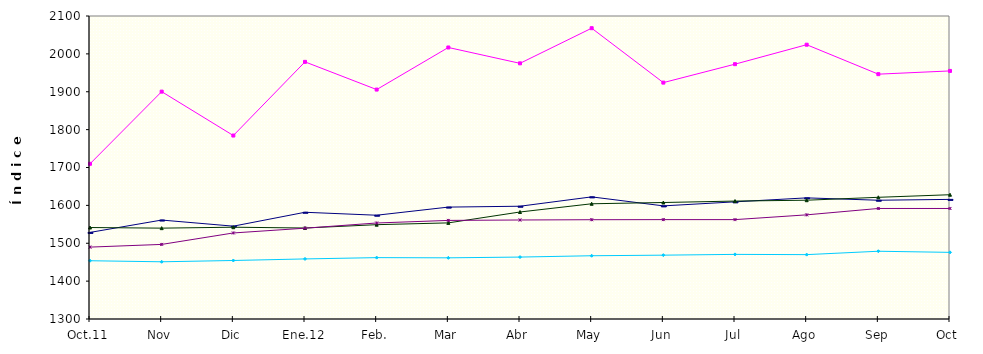
| Category | Series 0 | Series 1 | Series 2 | Series 3 | Series 4 |
|---|---|---|---|---|---|
| Oct.11 | 1528.607 | 1709.774 | 1541.504 | 1453.814 | 1489.835 |
| Nov | 1561.233 | 1900.321 | 1539.861 | 1451.065 | 1496.913 |
| Dic | 1545.123 | 1784.386 | 1542.342 | 1454.47 | 1527.182 |
| Ene.12 | 1581.782 | 1978.918 | 1540.257 | 1458.598 | 1539.754 |
| Feb. | 1573.979 | 1905.742 | 1549.031 | 1462.006 | 1553.485 |
| Mar | 1595.43 | 2016.906 | 1553.771 | 1461.495 | 1560.281 |
| Abr | 1597.737 | 1975.033 | 1582.514 | 1463.521 | 1561.426 |
| May | 1622.427 | 2067.811 | 1604.223 | 1467 | 1562.167 |
| Jun | 1598.643 | 1924.133 | 1607.572 | 1468.551 | 1562.406 |
| Jul | 1609.351 | 1972.837 | 1611.351 | 1470.592 | 1562.406 |
| Ago | 1619.803 | 2024.184 | 1613.649 | 1469.959 | 1574.985 |
| Sep | 1613.539 | 1946.447 | 1621.3 | 1478.905 | 1591.826 |
| Oct | 1615.808 | 1954.987 | 1628.128 | 1475.921 | 1591.826 |